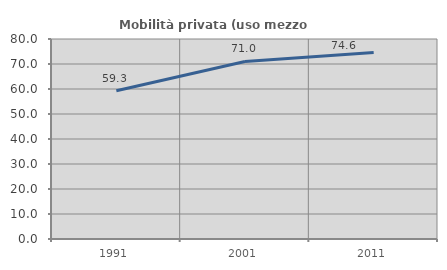
| Category | Mobilità privata (uso mezzo privato) |
|---|---|
| 1991.0 | 59.292 |
| 2001.0 | 71.028 |
| 2011.0 | 74.648 |